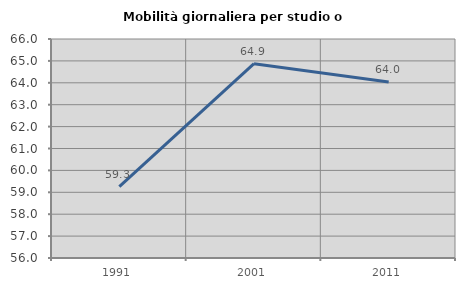
| Category | Mobilità giornaliera per studio o lavoro |
|---|---|
| 1991.0 | 59.263 |
| 2001.0 | 64.872 |
| 2011.0 | 64.035 |